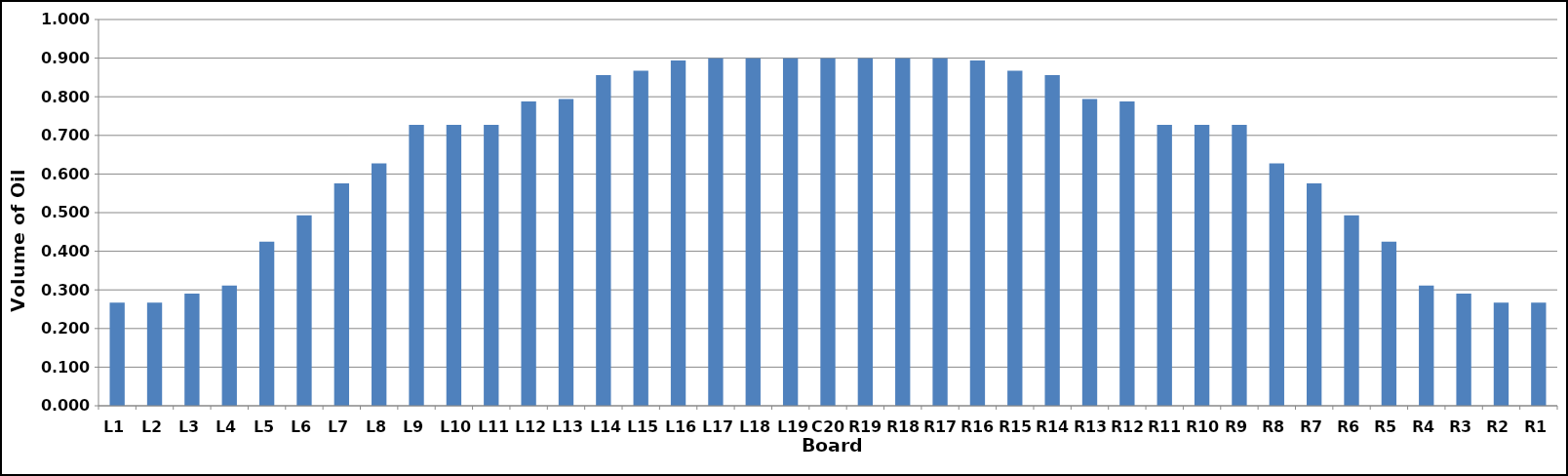
| Category | Series 0 |
|---|---|
| L1 | 0.267 |
| L2 | 0.267 |
| L3 | 0.29 |
| L4 | 0.311 |
| L5 | 0.425 |
| L6 | 0.493 |
| L7 | 0.576 |
| L8 | 0.627 |
| L9 | 0.727 |
| L10 | 0.727 |
| L11 | 0.727 |
| L12 | 0.788 |
| L13 | 0.794 |
| L14 | 0.856 |
| L15 | 0.868 |
| L16 | 0.894 |
| L17 | 0.9 |
| L18 | 0.9 |
| L19 | 0.9 |
| C20 | 0.9 |
| R19 | 0.9 |
| R18 | 0.9 |
| R17 | 0.9 |
| R16 | 0.894 |
| R15 | 0.868 |
| R14 | 0.856 |
| R13 | 0.794 |
| R12 | 0.788 |
| R11 | 0.727 |
| R10 | 0.727 |
| R9 | 0.727 |
| R8 | 0.627 |
| R7 | 0.576 |
| R6 | 0.493 |
| R5 | 0.425 |
| R4 | 0.311 |
| R3 | 0.29 |
| R2 | 0.267 |
| R1 | 0.267 |